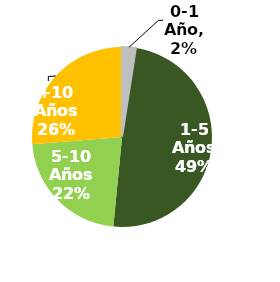
| Category | Series 0 |
|---|---|
| 0-1 Año | 0.025 |
| 1-5 Años | 0.491 |
| 5-10 Años | 0.222 |
| +10 Años | 0.263 |